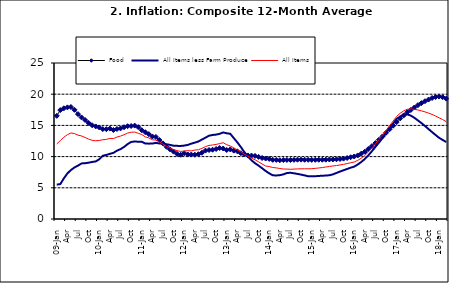
| Category | Food | All Items less Farm Produce | All Items |
|---|---|---|---|
| 09-Jan | 16.536 | 5.519 | 12.032 |
| Feb | 17.454 | 5.591 | 12.567 |
| Mar | 17.742 | 6.51 | 13.101 |
| Apr | 17.89 | 7.302 | 13.51 |
| May | 17.949 | 7.847 | 13.787 |
| June | 17.498 | 8.259 | 13.694 |
| Jul | 16.808 | 8.554 | 13.437 |
| Aug | 16.278 | 8.906 | 13.307 |
| Sep | 15.859 | 8.942 | 13.065 |
| Oct | 15.396 | 9.024 | 12.803 |
| Nov | 15.018 | 9.143 | 12.609 |
| Dec | 14.841 | 9.226 | 12.538 |
| 10-Jan | 14.668 | 9.567 | 12.586 |
| Feb | 14.411 | 10.138 | 12.7 |
| Mar | 14.395 | 10.269 | 12.757 |
| Apr | 14.489 | 10.444 | 12.915 |
| May | 14.266 | 10.597 | 12.893 |
| Jun | 14.424 | 10.948 | 13.132 |
| Jul | 14.514 | 11.193 | 13.284 |
| Aug | 14.706 | 11.549 | 13.5 |
| Sep | 14.872 | 11.997 | 13.764 |
| Oct | 14.906 | 12.345 | 13.908 |
| Nov | 14.967 | 12.423 | 13.928 |
| Dec | 14.723 | 12.383 | 13.74 |
| 11-Jan | 14.233 | 12.385 | 13.542 |
| Feb | 13.903 | 12.099 | 13.161 |
| Mar | 13.606 | 12.077 | 13.001 |
| Apr | 13.227 | 12.088 | 12.694 |
| May | 13.152 | 12.198 | 12.648 |
| Jun | 12.654 | 12.1 | 12.321 |
| Jul | 12.118 | 12.109 | 12.009 |
| Aug | 11.575 | 11.98 | 11.635 |
| Sep | 11.155 | 11.877 | 11.363 |
| Oct | 10.797 | 11.746 | 11.13 |
| Nov | 10.422 | 11.721 | 10.952 |
| Dec | 10.298 | 11.706 | 10.826 |
| 12-Jan | 10.538 | 11.765 | 10.886 |
| 12-Feb | 10.336 | 11.872 | 10.955 |
| 12-Mar | 10.325 | 12.075 | 10.914 |
| Apr | 10.304 | 12.242 | 11.054 |
| May | 10.387 | 12.419 | 11.096 |
| Jun | 10.617 | 12.732 | 11.32 |
| Jul | 10.963 | 13.032 | 11.599 |
| Aug | 11.056 | 13.349 | 11.791 |
| Sep | 11.104 | 13.467 | 11.859 |
| Oct | 11.216 | 13.525 | 11.948 |
| Nov | 11.372 | 13.649 | 12.091 |
| Dec | 11.296 | 13.873 | 12.224 |
| 13-Jan | 11.055 | 13.737 | 11.908 |
| Feb | 11.153 | 13.657 | 11.703 |
| Mar | 10.951 | 12.963 | 11.394 |
| Apr | 10.844 | 12.281 | 11.072 |
| May | 10.548 | 11.531 | 10.761 |
| Jun | 10.352 | 10.704 | 10.383 |
| Jul | 10.186 | 10.005 | 10.047 |
| Aug | 10.168 | 9.4 | 9.761 |
| Sep | 10.105 | 8.939 | 9.486 |
| Oct | 9.955 | 8.553 | 9.167 |
| Nov | 9.774 | 8.136 | 8.815 |
| Dec | 9.695 | 7.691 | 8.496 |
| 14-Jan | 9.626 | 7.317 | 8.408 |
| Feb | 9.484 | 7.005 | 8.257 |
| Mar | 9.464 | 6.976 | 8.19 |
| Apr | 9.416 | 7.03 | 8.092 |
| May | 9.448 | 7.151 | 8.012 |
| Jun | 9.464 | 7.369 | 7.998 |
| Jul | 9.459 | 7.411 | 7.968 |
| Aug | 9.481 | 7.325 | 7.996 |
| Sep | 9.501 | 7.228 | 8.027 |
| Oct | 9.508 | 7.116 | 8.047 |
| Nov | 9.492 | 6.991 | 8.046 |
| Dec | 9.481 | 6.854 | 8.047 |
| 15-Jan | 9.475 | 6.865 | 8.063 |
| Feb | 9.486 | 6.852 | 8.117 |
| Mar | 9.495 | 6.905 | 8.176 |
| Apr | 9.501 | 6.922 | 8.243 |
| May | 9.51 | 6.975 | 8.331 |
| Jun | 9.535 | 7.006 | 8.417 |
| Jul | 9.552 | 7.154 | 8.497 |
| Aug | 9.571 | 7.384 | 8.566 |
| Sep | 9.614 | 7.605 | 8.658 |
| Oct | 9.68 | 7.812 | 8.76 |
| Nov | 9.778 | 8.016 | 8.879 |
| Dec | 9.898 | 8.222 | 9.009 |
| 16-Jan | 10.017 | 8.391 | 9.13 |
| Feb | 10.184 | 8.732 | 9.386 |
| Mar | 10.471 | 9.132 | 9.751 |
| Apr | 10.786 | 9.614 | 10.182 |
| May | 11.221 | 10.196 | 10.746 |
| Jun | 11.672 | 10.864 | 11.372 |
| Jul | 12.162 | 11.553 | 12.045 |
| Aug | 12.696 | 12.247 | 12.744 |
| Sep | 13.238 | 12.98 | 13.454 |
| Oct | 13.817 | 13.757 | 14.206 |
| Nov | 14.386 | 14.542 | 14.958 |
| Dec | 14.946 | 15.307 | 15.697 |
| 17-Jan | 15.536 | 16.042 | 16.441 |
| Feb | 16.127 | 16.436 | 16.958 |
| Mar | 16.598 | 16.682 | 17.315 |
| Apr | 17.106 | 16.772 | 17.591 |
| May | 17.477 | 16.567 | 17.628 |
| Jun | 17.868 | 16.219 | 17.578 |
| Jul | 18.247 | 15.798 | 17.475 |
| Aug | 18.569 | 15.372 | 17.331 |
| Sep | 18.876 | 14.903 | 17.17 |
| Oct | 19.14 | 14.415 | 16.968 |
| Nov | 19.392 | 13.93 | 16.76 |
| Dec | 19.546 | 13.458 | 16.502 |
| 18-Jan | 19.621 | 13.01 | 16.215 |
| Feb | 19.521 | 12.668 | 15.93 |
| Mar | 19.294 | 12.33 | 15.599 |